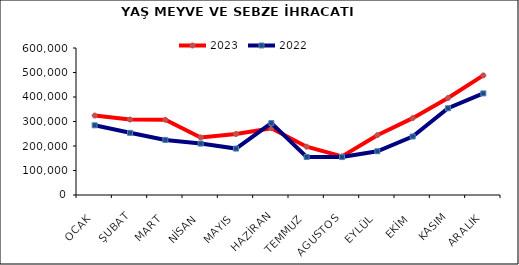
| Category | 2023 | 2022 |
|---|---|---|
| OCAK | 324176.462 | 284427.628 |
| ŞUBAT | 308025.515 | 253755.516 |
| MART | 306941.339 | 224880.329 |
| NİSAN | 234938.641 | 209873.586 |
| MAYIS | 248942.205 | 189527.817 |
| HAZİRAN | 272479.314 | 293428.898 |
| TEMMUZ | 197102.692 | 155047.715 |
| AGUSTOS | 157614.449 | 154822.782 |
| EYLÜL | 244236.419 | 178508.834 |
| EKİM | 313711.498 | 238876.244 |
| KASIM | 395990.429 | 354076.341 |
| ARALIK | 488154.645 | 414730.325 |